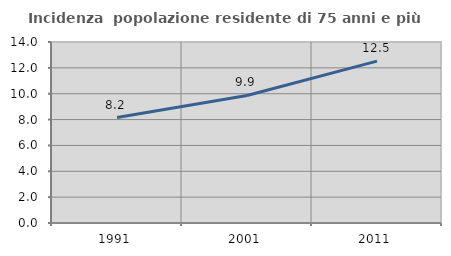
| Category | Incidenza  popolazione residente di 75 anni e più |
|---|---|
| 1991.0 | 8.16 |
| 2001.0 | 9.865 |
| 2011.0 | 12.523 |